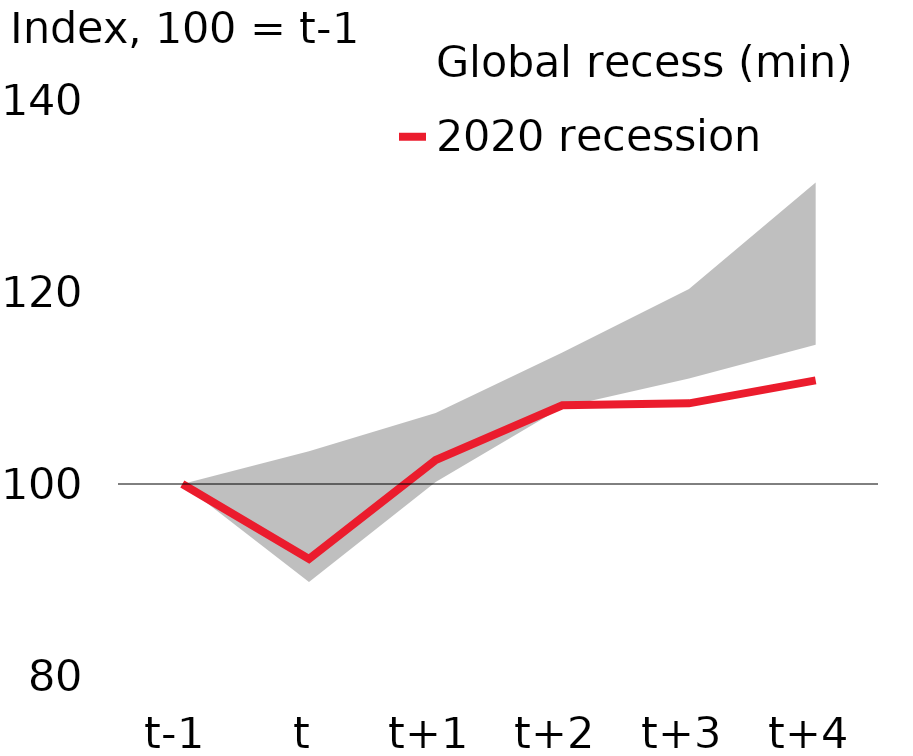
| Category | 2020 recession |
|---|---|
| t-1 | 100 |
| t | 92.2 |
| t+1 | 102.5 |
| t+2 | 108.2 |
| t+3 | 108.4 |
| t+4 | 110.8 |